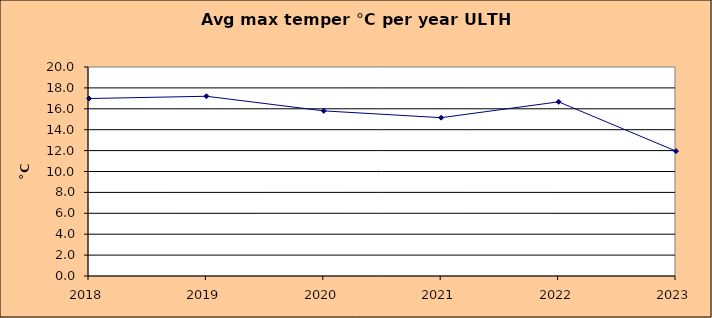
| Category | Series 0 |
|---|---|
| 2018.0 | 16.983 |
| 2019.0 | 17.2 |
| 2020.0 | 15.8 |
| 2021.0 | 15.15 |
| 2022.0 | 16.667 |
| 2023.0 | 11.95 |